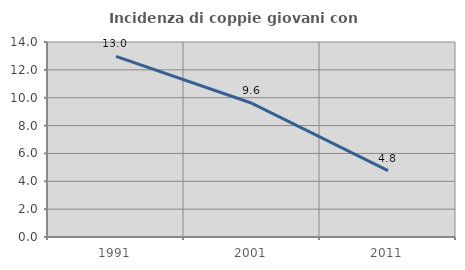
| Category | Incidenza di coppie giovani con figli |
|---|---|
| 1991.0 | 12.963 |
| 2001.0 | 9.6 |
| 2011.0 | 4.762 |